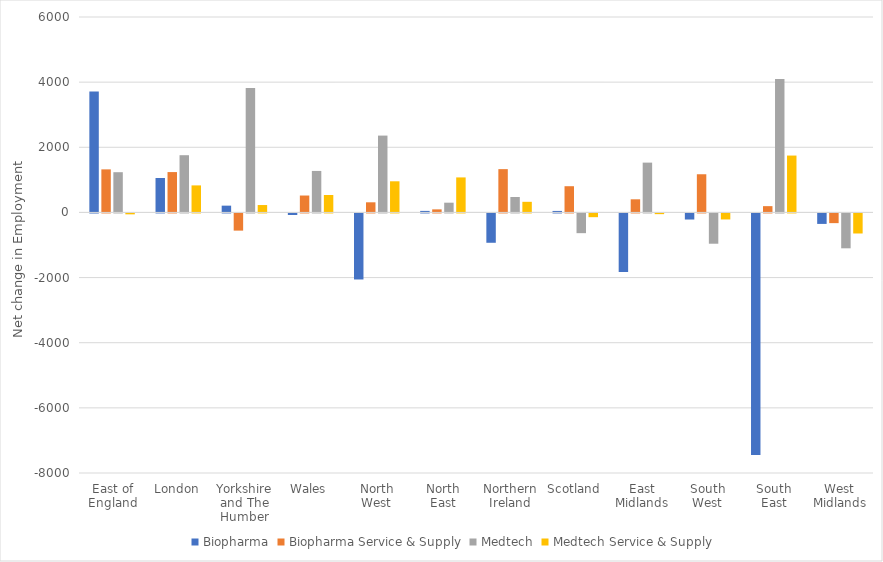
| Category | Biopharma | Biopharma Service & Supply | Medtech | Medtech Service & Supply |
|---|---|---|---|---|
| East of England | 3715 | 1322 | 1235 | -28 |
| London | 1057 | 1239 | 1757 | 830 |
| Yorkshire and The Humber | 208 | -528 | 3823 | 227 |
| Wales | -48 | 519 | 1274 | 535 |
| North West | -2028 | 311 | 2359 | 956 |
| North East | 47 | 94 | 299 | 1075 |
| Northern Ireland | -901 | 1329 | 474 | 326 |
| Scotland | 46 | 805 | -606 | -115 |
| East Midlands | -1798 | 403 | 1529 | -22 |
| South West | -187 | 1172 | -930 | -185 |
| South East | -7414 | 193 | 4095 | 1746 |
| West Midlands | -322 | -298 | -1071 | -616 |